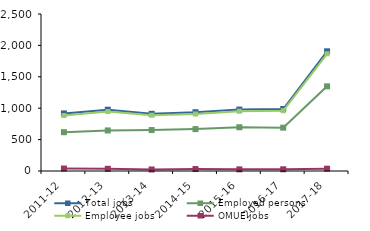
| Category | Total jobs | Employed persons | Employee jobs | OMUE jobs |
|---|---|---|---|---|
| 2011-12 | 917 | 618 | 883 | 39 |
| 2012-13 | 976 | 646 | 946 | 35 |
| 2013-14 | 911 | 652 | 888 | 24 |
| 2014-15 | 936 | 667 | 908 | 31 |
| 2015-16 | 978 | 697 | 952 | 26 |
| 2016-17 | 987 | 690 | 960 | 27 |
| 2017-18 | 1906 | 1348 | 1866 | 37 |